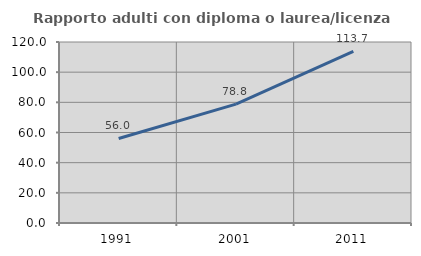
| Category | Rapporto adulti con diploma o laurea/licenza media  |
|---|---|
| 1991.0 | 56.039 |
| 2001.0 | 78.81 |
| 2011.0 | 113.725 |